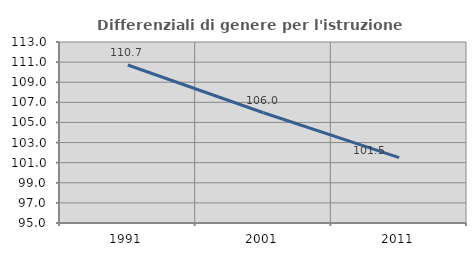
| Category | Differenziali di genere per l'istruzione superiore |
|---|---|
| 1991.0 | 110.716 |
| 2001.0 | 105.961 |
| 2011.0 | 101.495 |